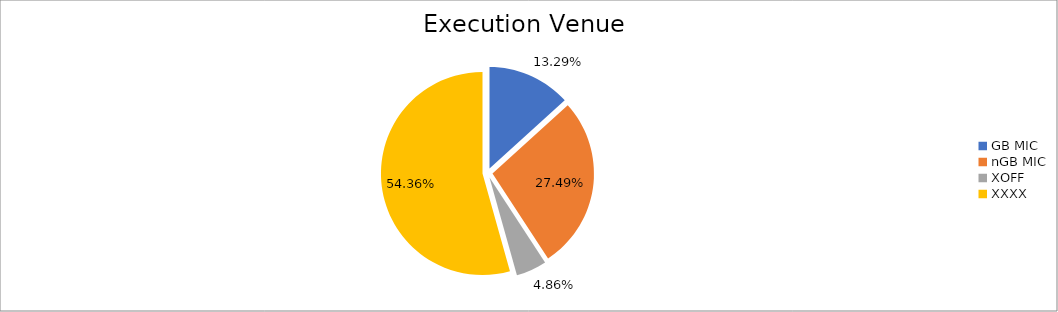
| Category | Series 0 |
|---|---|
| GB MIC | 1203354.335 |
| nGB MIC | 2489754.363 |
| XOFF | 440435.598 |
| XXXX | 4922705.981 |